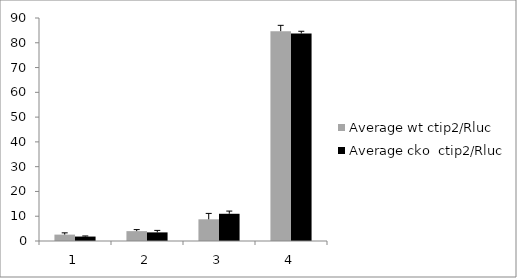
| Category | Average wt ctip2/Rluc | Average cko  ctip2/Rluc |
|---|---|---|
| 0 | 2.579 | 1.791 |
| 1 | 3.981 | 3.474 |
| 2 | 8.75 | 10.986 |
| 3 | 84.691 | 83.75 |